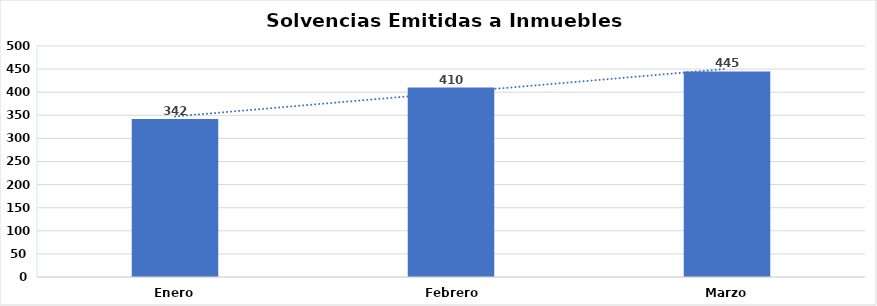
| Category | Series 0 |
|---|---|
| Enero | 342 |
| Febrero  | 410 |
| Marzo | 445 |